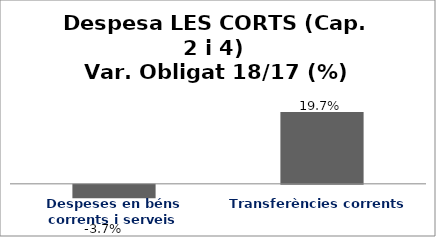
| Category | Series 0 |
|---|---|
| Despeses en béns corrents i serveis | -0.037 |
| Transferències corrents | 0.197 |